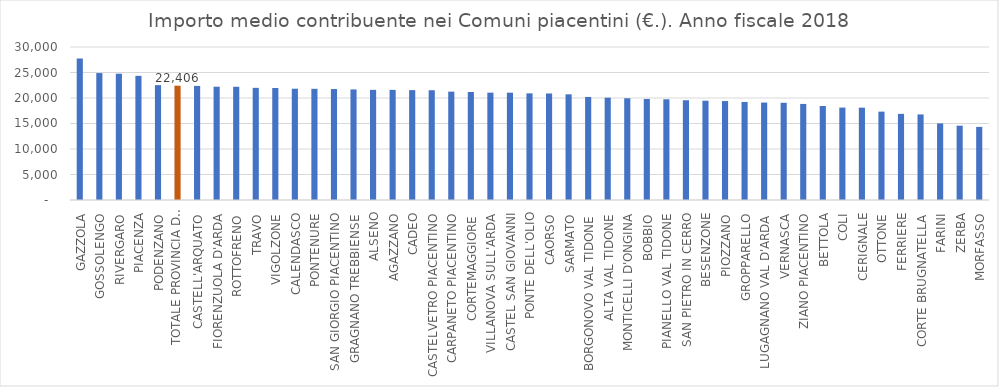
| Category | Series 0 |
|---|---|
| GAZZOLA | 27758.38 |
| GOSSOLENGO | 24890.922 |
| RIVERGARO | 24763.957 |
| PIACENZA | 24347.545 |
| PODENZANO | 22518.66 |
| TOTALE PROVINCIA DI PIACENZA | 22406.017 |
| CASTELL'ARQUATO | 22372.288 |
| FIORENZUOLA D'ARDA | 22215.515 |
| ROTTOFRENO | 22201.233 |
| TRAVO | 21988.795 |
| VIGOLZONE | 21959.183 |
| CALENDASCO | 21819.627 |
| PONTENURE | 21798.936 |
| SAN GIORGIO PIACENTINO | 21756.553 |
| GRAGNANO TREBBIENSE | 21679.805 |
| ALSENO | 21595.31 |
| AGAZZANO | 21593.586 |
| CADEO | 21546.1 |
| CASTELVETRO PIACENTINO | 21527.057 |
| CARPANETO PIACENTINO | 21246.941 |
| CORTEMAGGIORE | 21174.3 |
| VILLANOVA SULL'ARDA | 21046.23 |
| CASTEL SAN GIOVANNI | 21044.582 |
| PONTE DELL'OLIO | 20911.704 |
| CAORSO | 20886.469 |
| SARMATO | 20719.406 |
| BORGONOVO VAL TIDONE | 20209.663 |
| ALTA VAL TIDONE | 20063.791 |
| MONTICELLI D'ONGINA | 19948.594 |
| BOBBIO | 19810.143 |
| PIANELLO VAL TIDONE | 19748.592 |
| SAN PIETRO IN CERRO | 19557.046 |
| BESENZONE | 19468.622 |
| PIOZZANO | 19401.391 |
| GROPPARELLO | 19229.086 |
| LUGAGNANO VAL D'ARDA | 19105.747 |
| VERNASCA | 19062.426 |
| ZIANO PIACENTINO | 18837.291 |
| BETTOLA | 18430.713 |
| COLI | 18118.233 |
| CERIGNALE | 18106.237 |
| OTTONE | 17327.665 |
| FERRIERE | 16884.846 |
| CORTE BRUGNATELLA | 16779.925 |
| FARINI | 15021.865 |
| ZERBA | 14575.167 |
| MORFASSO | 14330.859 |